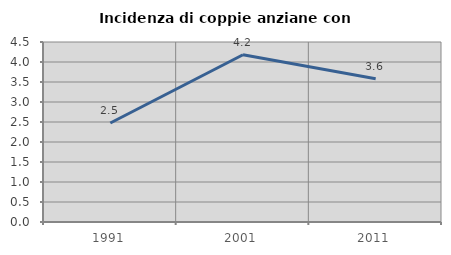
| Category | Incidenza di coppie anziane con figli |
|---|---|
| 1991.0 | 2.476 |
| 2001.0 | 4.182 |
| 2011.0 | 3.582 |